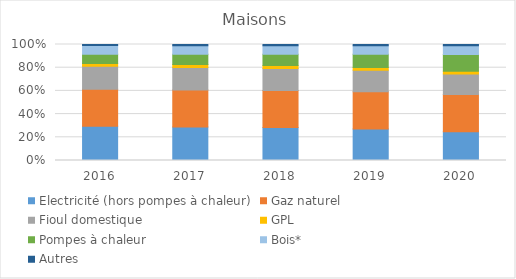
| Category | Electricité (hors pompes à chaleur) | Gaz naturel | Fioul domestique | GPL | Pompes à chaleur | Bois* | Autres |
|---|---|---|---|---|---|---|---|
| 2016.0 | 0.296 | 0.319 | 0.197 | 0.025 | 0.079 | 0.074 | 0.01 |
| 2017.0 | 0.29 | 0.319 | 0.193 | 0.025 | 0.088 | 0.074 | 0.01 |
| 2018.0 | 0.284 | 0.32 | 0.19 | 0.025 | 0.097 | 0.074 | 0.01 |
| 2019.0 | 0.272 | 0.321 | 0.185 | 0.025 | 0.113 | 0.074 | 0.011 |
| 2020.0 | 0.247 | 0.322 | 0.176 | 0.024 | 0.143 | 0.077 | 0.01 |